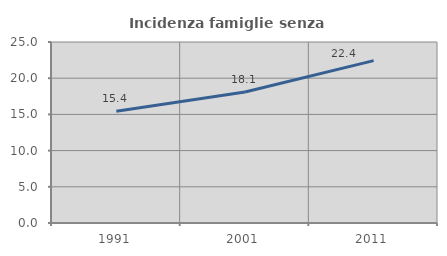
| Category | Incidenza famiglie senza nuclei |
|---|---|
| 1991.0 | 15.449 |
| 2001.0 | 18.084 |
| 2011.0 | 22.424 |